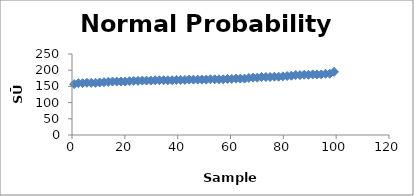
| Category | Series 0 |
|---|---|
| 0.8064516129032258 | 157 |
| 2.419354838709677 | 160 |
| 4.032258064516129 | 160 |
| 5.64516129032258 | 161 |
| 7.258064516129032 | 161 |
| 8.870967741935484 | 161 |
| 10.483870967741934 | 162 |
| 12.096774193548386 | 163 |
| 13.709677419354838 | 164 |
| 15.32258064516129 | 165 |
| 16.93548387096774 | 165 |
| 18.548387096774192 | 165 |
| 20.16129032258064 | 165 |
| 21.774193548387093 | 166 |
| 23.387096774193544 | 167 |
| 24.999999999999996 | 167 |
| 26.61290322580645 | 168 |
| 28.2258064516129 | 168 |
| 29.838709677419352 | 168 |
| 31.451612903225804 | 169 |
| 33.064516129032256 | 169 |
| 34.677419354838705 | 169 |
| 36.29032258064516 | 169 |
| 37.90322580645161 | 169 |
| 39.51612903225806 | 170 |
| 41.12903225806451 | 170 |
| 42.74193548387096 | 170 |
| 44.354838709677416 | 171 |
| 45.967741935483865 | 171 |
| 47.58064516129032 | 171 |
| 49.19354838709677 | 171 |
| 50.806451612903224 | 171 |
| 52.41935483870967 | 172 |
| 54.03225806451612 | 172 |
| 55.64516129032258 | 172 |
| 57.258064516129025 | 172 |
| 58.87096774193548 | 173 |
| 60.48387096774193 | 173 |
| 62.096774193548384 | 174 |
| 63.70967741935483 | 174 |
| 65.3225806451613 | 174 |
| 66.93548387096774 | 176 |
| 68.54838709677419 | 177 |
| 70.16129032258064 | 177 |
| 71.7741935483871 | 179 |
| 73.38709677419355 | 179 |
| 75.0 | 179 |
| 76.61290322580645 | 180 |
| 78.2258064516129 | 180 |
| 79.83870967741936 | 181 |
| 81.45161290322581 | 182 |
| 83.06451612903226 | 183 |
| 84.6774193548387 | 185 |
| 86.29032258064517 | 185 |
| 87.90322580645162 | 186 |
| 89.51612903225806 | 186 |
| 91.12903225806451 | 187 |
| 92.74193548387096 | 187 |
| 94.35483870967742 | 187 |
| 95.96774193548387 | 189 |
| 97.58064516129032 | 189 |
| 99.19354838709677 | 195 |